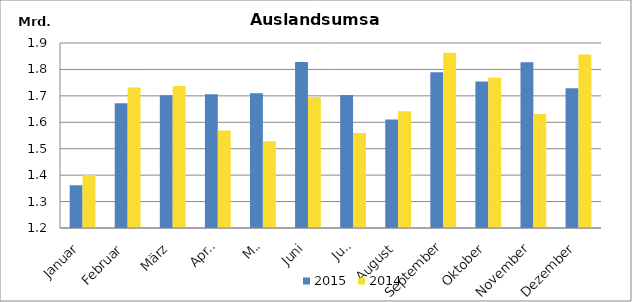
| Category | 2015 | 2014 |
|---|---|---|
| Januar | 1361667.743 | 1400463.385 |
| Februar | 1671816.933 | 1731260.859 |
| März | 1702150.506 | 1737680.575 |
| April | 1706186.784 | 1568555.193 |
| Mai | 1710024.43 | 1528561.963 |
| Juni | 1828057.951 | 1694930.321 |
| Juli | 1703091.418 | 1559151.484 |
| August | 1610888.581 | 1641811.392 |
| September | 1789326.483 | 1863078.479 |
| Oktober | 1753889.658 | 1768818.579 |
| November | 1827517.992 | 1631100.953 |
| Dezember | 1728455.913 | 1856430.203 |